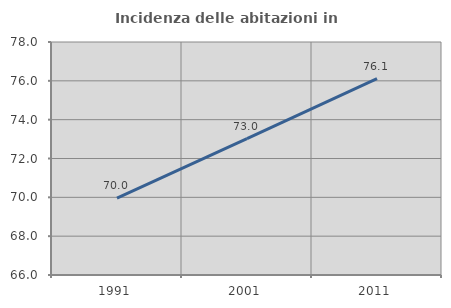
| Category | Incidenza delle abitazioni in proprietà  |
|---|---|
| 1991.0 | 69.963 |
| 2001.0 | 73.024 |
| 2011.0 | 76.116 |